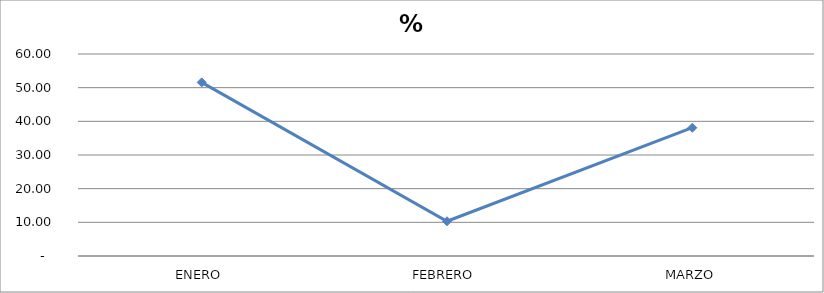
| Category | % |
|---|---|
| ENERO | 51.576 |
| FEBRERO | 10.319 |
| MARZO | 38.105 |